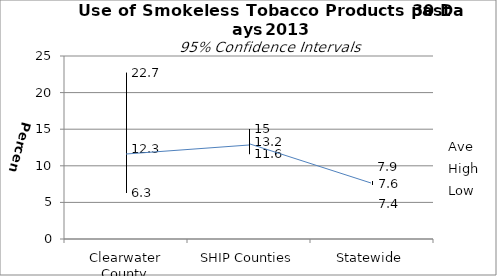
| Category | Ave | High | Low |
|---|---|---|---|
| Clearwater County | 12.3 | 22.7 | 6.3 |
| SHIP Counties | 13.2 | 15 | 11.6 |
| Statewide | 7.6 | 7.9 | 7.4 |